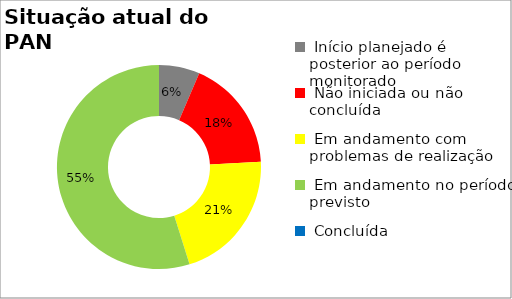
| Category | Series 0 |
|---|---|
|  Início planejado é posterior ao período monitorado | 0.065 |
|  Não iniciada ou não concluída | 0.177 |
|  Em andamento com problemas de realização | 0.21 |
|  Em andamento no período previsto  | 0.548 |
|  Concluída | 0 |